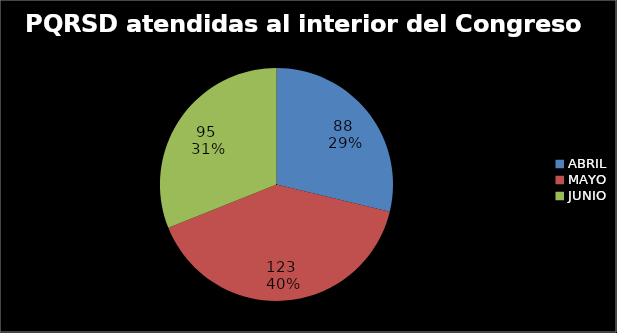
| Category |  PQRSD atendidas al interior del Congreso |
|---|---|
| ABRIL | 88 |
| MAYO | 123 |
| JUNIO | 95 |